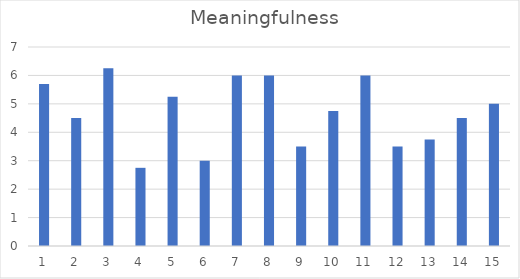
| Category | Meaningfulness |
|---|---|
| 0 | 5.7 |
| 1 | 4.5 |
| 2 | 6.25 |
| 3 | 2.75 |
| 4 | 5.25 |
| 5 | 3 |
| 6 | 6 |
| 7 | 6 |
| 8 | 3.5 |
| 9 | 4.75 |
| 10 | 6 |
| 11 | 3.5 |
| 12 | 3.75 |
| 13 | 4.5 |
| 14 | 5 |